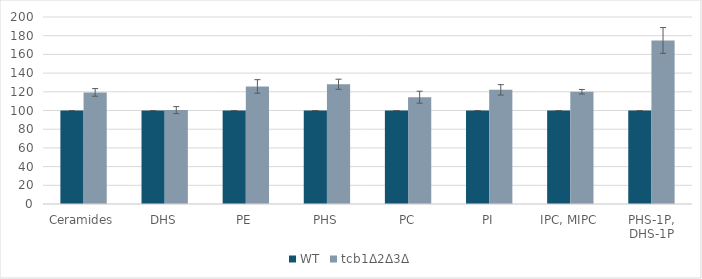
| Category | WT | tcb1Δ2Δ3Δ |
|---|---|---|
| Ceramides | 100 | 119.342 |
| DHS | 100 | 100.409 |
| PE | 100 | 125.727 |
| PHS | 100 | 128.052 |
| PC | 100 | 114.222 |
| PI | 100 | 122.078 |
| IPC, MIPC | 100 | 120.046 |
| PHS-1P, DHS-1P | 100 | 174.927 |